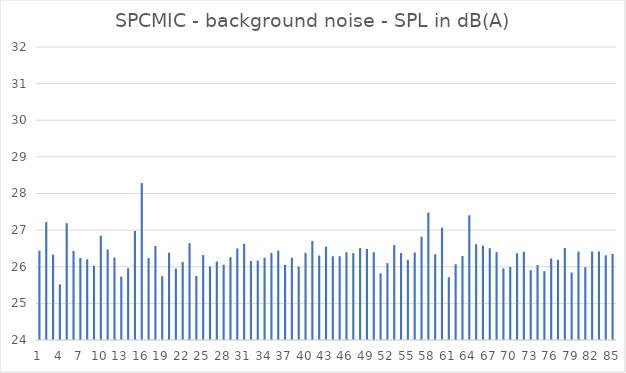
| Category | Series 0 |
|---|---|
| 0 | 26.438 |
| 1 | 27.218 |
| 2 | 26.329 |
| 3 | 25.519 |
| 4 | 27.189 |
| 5 | 26.427 |
| 6 | 26.244 |
| 7 | 26.203 |
| 8 | 26.024 |
| 9 | 26.847 |
| 10 | 26.472 |
| 11 | 26.252 |
| 12 | 25.731 |
| 13 | 25.958 |
| 14 | 26.978 |
| 15 | 28.284 |
| 16 | 26.236 |
| 17 | 26.566 |
| 18 | 25.743 |
| 19 | 26.383 |
| 20 | 25.949 |
| 21 | 26.127 |
| 22 | 26.644 |
| 23 | 25.749 |
| 24 | 26.317 |
| 25 | 26.007 |
| 26 | 26.142 |
| 27 | 26.055 |
| 28 | 26.261 |
| 29 | 26.498 |
| 30 | 26.626 |
| 31 | 26.156 |
| 32 | 26.167 |
| 33 | 26.246 |
| 34 | 26.38 |
| 35 | 26.439 |
| 36 | 26.05 |
| 37 | 26.243 |
| 38 | 26.001 |
| 39 | 26.381 |
| 40 | 26.707 |
| 41 | 26.307 |
| 42 | 26.548 |
| 43 | 26.285 |
| 44 | 26.288 |
| 45 | 26.396 |
| 46 | 26.374 |
| 47 | 26.508 |
| 48 | 26.484 |
| 49 | 26.397 |
| 50 | 25.822 |
| 51 | 26.099 |
| 52 | 26.59 |
| 53 | 26.372 |
| 54 | 26.188 |
| 55 | 26.387 |
| 56 | 26.819 |
| 57 | 27.479 |
| 58 | 26.34 |
| 59 | 27.066 |
| 60 | 25.714 |
| 61 | 26.068 |
| 62 | 26.295 |
| 63 | 27.405 |
| 64 | 26.614 |
| 65 | 26.579 |
| 66 | 26.508 |
| 67 | 26.401 |
| 68 | 25.954 |
| 69 | 25.991 |
| 70 | 26.37 |
| 71 | 26.413 |
| 72 | 25.909 |
| 73 | 26.044 |
| 74 | 25.878 |
| 75 | 26.226 |
| 76 | 26.191 |
| 77 | 26.513 |
| 78 | 25.843 |
| 79 | 26.415 |
| 80 | 25.985 |
| 81 | 26.419 |
| 82 | 26.419 |
| 83 | 26.312 |
| 84 | 26.35 |